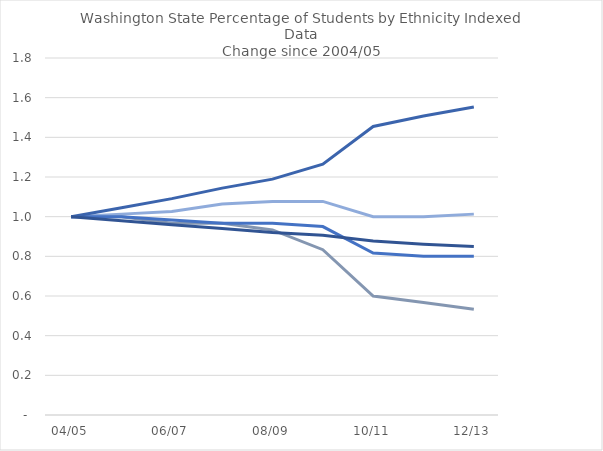
| Category | American Indian | Asian | Black | Hispanic | White |
|---|---|---|---|---|---|
| 04/05 | 1 | 1 | 1 | 1 | 1 |
|  | 1 | 1.013 | 1 | 1.045 | 0.98 |
| 06/07 | 0.967 | 1.026 | 0.983 | 1.091 | 0.96 |
|  | 0.967 | 1.064 | 0.967 | 1.144 | 0.941 |
| 08/09 | 0.933 | 1.077 | 0.967 | 1.189 | 0.921 |
|  | 0.833 | 1.077 | 0.95 | 1.265 | 0.906 |
| 10/11 | 0.6 | 1 | 0.817 | 1.455 | 0.877 |
|  | 0.567 | 1 | 0.8 | 1.508 | 0.861 |
| 12/13 | 0.533 | 1.013 | 0.8 | 1.553 | 0.85 |